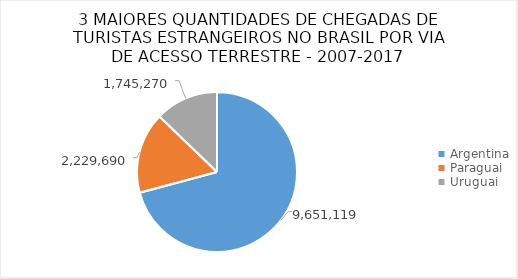
| Category | Series 0 |
|---|---|
| Argentina | 9651119 |
| Paraguai | 2229690 |
| Uruguai | 1745270 |